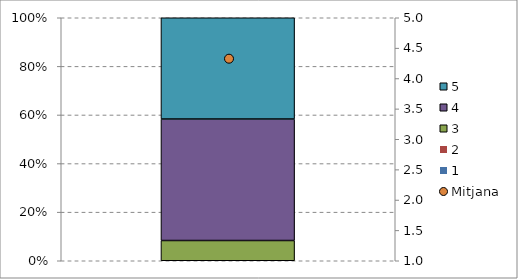
| Category | 1 | 2 | 3 | 4 | 5 |
|---|---|---|---|---|---|
| 0 | 0 | 0 | 0.083 | 0.5 | 0.417 |